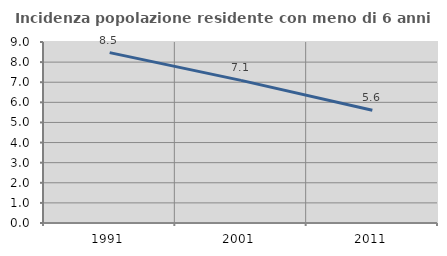
| Category | Incidenza popolazione residente con meno di 6 anni |
|---|---|
| 1991.0 | 8.47 |
| 2001.0 | 7.093 |
| 2011.0 | 5.606 |